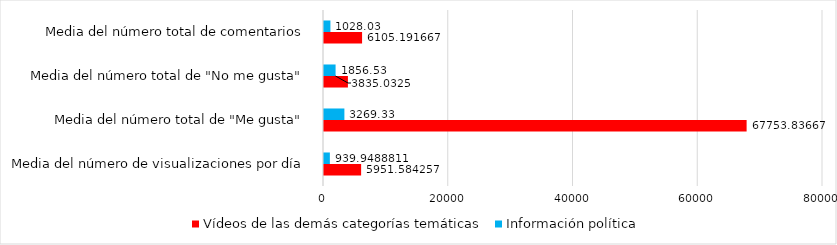
| Category | Vídeos de las demás categorías temáticas | Información política |
|---|---|---|
| Media del número de visualizaciones por día | 5951.584 | 939.949 |
| Media del número total de "Me gusta" | 67753.837 | 3269.33 |
| Media del número total de "No me gusta" | 3835.032 | 1856.53 |
| Media del número total de comentarios | 6105.192 | 1028.03 |